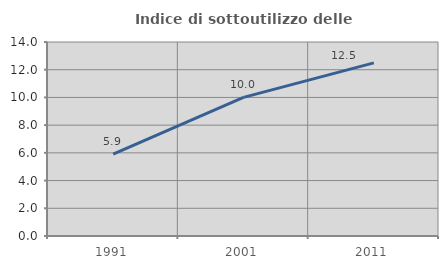
| Category | Indice di sottoutilizzo delle abitazioni  |
|---|---|
| 1991.0 | 5.914 |
| 2001.0 | 10.006 |
| 2011.0 | 12.493 |